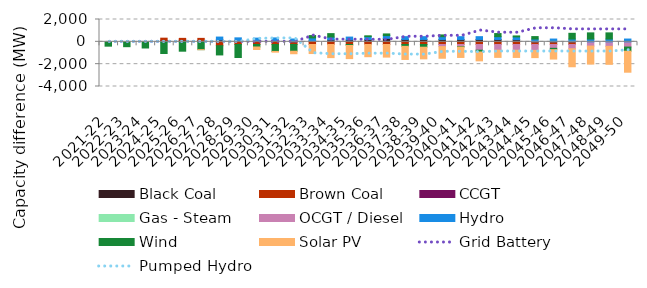
| Category | Black Coal | Brown Coal | CCGT | Gas - Steam | OCGT / Diesel | Hydro | Wind | Solar PV |
|---|---|---|---|---|---|---|---|---|
| 2021-22 | 0 | 0 | 0 | 0 | 0 | 0 | -388.399 | 0 |
| 2022-23 | 0 | 0 | 0 | 0 | 0 | 0 | -434.399 | 0 |
| 2023-24 | 0 | 0 | 0 | 0 | 0 | 0 | -551.95 | 0 |
| 2024-25 | 128.144 | 199.833 | 0 | 0 | 0 | 0 | -1046.095 | 0 |
| 2025-26 | 148.59 | 161.603 | 0 | 0 | 0 | 0 | -838.244 | 0 |
| 2026-27 | 106.231 | 203.474 | 0 | 0 | 0 | 0 | -700.589 | 0 |
| 2027-28 | 176.758 | -347.48 | 0 | 0 | 0 | 250 | -825.336 | 0 |
| 2028-29 | 106.232 | -238.965 | 0 | 0 | 0 | 250 | -1166.363 | 0 |
| 2029-30 | 82.001 | -238.965 | 0 | 0 | 0 | 250 | -222.31 | -227.583 |
| 2030-31 | 100.672 | -238.965 | 0 | 0 | 0 | 250 | -620.062 | -66.368 |
| 2031-32 | 3.908 | -238.965 | 0 | 0 | 0 | 250 | -601.507 | -225.684 |
| 2032-33 | 100.672 | -238.965 | 0 | 0 | 0 | 250 | 209.514 | -809.545 |
| 2033-34 | 175.713 | -238.965 | 0 | 0 | 0 | 250 | 308.902 | -1175.303 |
| 2034-35 | 175.713 | -238.965 | 0 | 0 | 0 | 250 | -88.29 | -1175.303 |
| 2035-36 | 212.586 | -238.965 | 0 | 0 | 0 | 250 | 76.837 | -1093.139 |
| 2036-37 | 308.167 | -238.965 | 0 | 0 | 0 | 250 | 150.348 | -1128.128 |
| 2037-38 | 212.586 | -238.965 | 0 | 0 | 0 | 250 | -166.965 | -1172.259 |
| 2038-39 | 212.586 | -238.965 | 0 | 0 | 0 | 250 | -241.891 | -1043.403 |
| 2039-40 | 212.586 | -238.965 | 0 | 0 | -187.566 | 250 | 155.038 | -1043.403 |
| 2040-41 | 212.586 | -238.965 | 0 | 0 | -187.566 | 250 | -39.723 | -931.767 |
| 2041-42 | 212.586 | -238.965 | 0 | 0 | -509.229 | 250 | -163.317 | -791.461 |
| 2042-43 | 212.586 | -238.965 | 0 | 0 | -509.229 | 250 | 278.094 | -644.464 |
| 2043-44 | 191.076 | -238.965 | 0 | 0 | -514.155 | 250 | 87.73 | -644.464 |
| 2044-45 | 0.002 | -238.965 | 0 | 0 | -529.661 | 250 | 219.673 | -644.464 |
| 2045-46 | 0 | -238.965 | 0 | 0 | -342.034 | 250 | -119.265 | -842.305 |
| 2046-47 | 0 | -238.965 | 0 | 0 | -381.177 | 250 | 513.303 | -1611.884 |
| 2047-48 | 0 | 0 | 0 | 0 | -381.177 | 250 | 552.158 | -1611.884 |
| 2048-49 | 0 | 0 | 0 | 0 | -403.608 | 250 | 552.158 | -1611.884 |
| 2049-50 | 0 | 0 | 0 | 0 | -466.835 | 250 | -371.66 | -1882.32 |